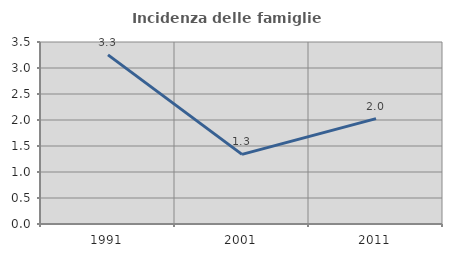
| Category | Incidenza delle famiglie numerose |
|---|---|
| 1991.0 | 3.253 |
| 2001.0 | 1.338 |
| 2011.0 | 2.026 |